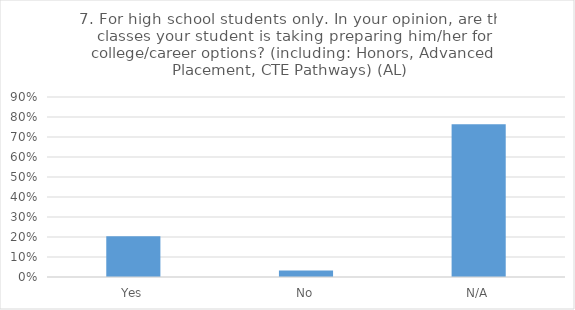
| Category | 7. For high school students only. In your opinion, are the classes your student is taking preparing him/her for college/career options? (including: Honors, Advanced Placement, CTE Pathways) (AL) |
|---|---|
| Yes | 0.204 |
| No | 0.032 |
| N/A | 0.763 |